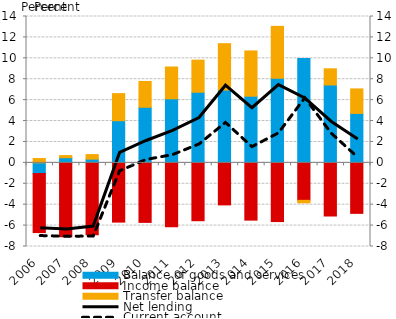
| Category | Balance of goods and services | Income balance | Transfer balance |
|---|---|---|---|
| 2006.0 | -1.021 | -5.647 | 0.414 |
| 2007.0 | 0.494 | -7.066 | 0.2 |
| 2008.0 | 0.357 | -6.883 | 0.435 |
| 2009.0 | 4.031 | -5.668 | 2.592 |
| 2010.0 | 5.32 | -5.693 | 2.467 |
| 2011.0 | 6.129 | -6.106 | 3.042 |
| 2012.0 | 6.755 | -5.534 | 3.07 |
| 2013.0 | 6.963 | -4.021 | 4.438 |
| 2014.0 | 6.377 | -5.477 | 4.329 |
| 2015.0 | 8.094 | -5.616 | 4.961 |
| 2016.0 | 9.982 | -3.583 | -0.238 |
| 2017.0 | 7.448 | -5.083 | 1.549 |
| 2018.0 | 4.729 | -4.83 | 2.345 |